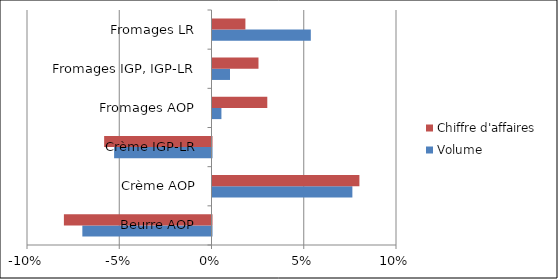
| Category | Volume | Chiffre d'affaires |
|---|---|---|
| Beurre AOP | -0.07 | -0.08 |
| Crème AOP | 0.076 | 0.08 |
| Crème IGP-LR | -0.053 | -0.058 |
| Fromages AOP | 0.005 | 0.03 |
| Fromages IGP, IGP-LR | 0.009 | 0.025 |
| Fromages LR | 0.053 | 0.018 |